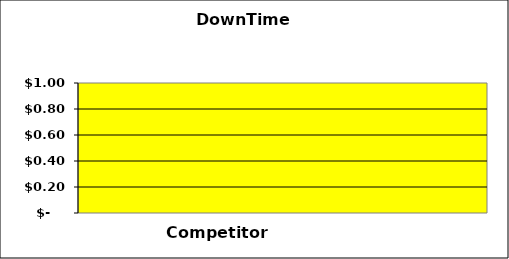
| Category | Series 0 | Series 1 | Series 2 |
|---|---|---|---|
| 0 | 0 |  | 0 |